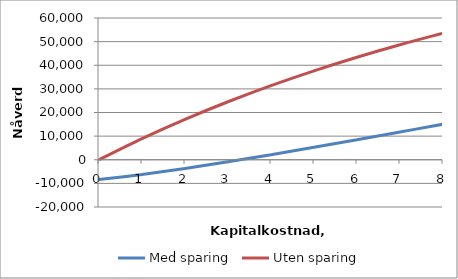
| Category | Med sparing | Uten sparing |
|---|---|---|
| 0.0 | -8400 | 0 |
| 1.0 | -6207.725 | 8939.07 |
| 2.0 | -3667.911 | 17095.905 |
| 3.0 | -865.196 | 24551.952 |
| 4.0 | 2130.653 | 31379.115 |
| 5.0 | 5262.273 | 37640.98 |
| 6.0 | 8482.643 | 43393.873 |
| 7.0 | 11753.371 | 48687.764 |
| 8.0 | 15043.254 | 53567.064 |